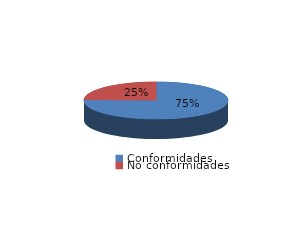
| Category | Series 0 |
|---|---|
| Conformidades | 1146 |
| No conformidades | 375 |